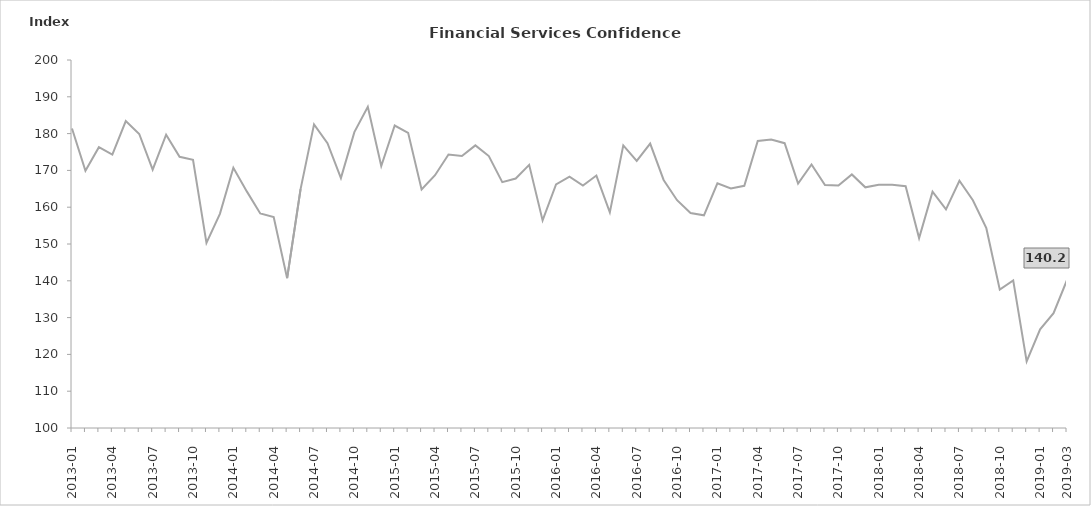
| Category | FSCI |
|---|---|
| 2013-01 | 181.4 |
|  | 169.9 |
|  | 176.3 |
| 2013-04 | 174.3 |
|  | 183.4 |
|  | 179.9 |
| 2013-07 | 170.2 |
|  | 179.7 |
|  | 173.7 |
| 2013-10 | 172.9 |
|  | 150.3 |
|  | 158.2 |
| 2014-01 | 170.7 |
|  | 164.3 |
|  | 158.3 |
| 2014-04 | 157.3 |
|  | 140.7 |
|  | 164.9 |
| 2014-07 | 182.5 |
|  | 177.4 |
|  | 167.9 |
| 2014-10 | 180.4 |
|  | 187.3 |
|  | 171.2 |
| 2015-01 | 182.2 |
|  | 180.2 |
|  | 164.8 |
| 2015-04 | 168.7 |
|  | 174.3 |
|  | 173.9 |
| 2015-07 | 176.8 |
|  | 173.9 |
|  | 166.8 |
| 2015-10 | 167.8 |
|  | 171.5 |
|  | 156.4 |
| 2016-01 | 166.2 |
|  | 168.3 |
|  | 165.9 |
| 2016-04 | 168.6 |
|  | 158.6 |
|  | 176.8 |
| 2016-07 | 172.6 |
|  | 177.3 |
|  | 167.4 |
| 2016-10 | 161.9 |
|  | 158.4 |
|  | 157.8 |
| 2017-01 | 166.5 |
|  | 165.1 |
|  | 165.8 |
| 2017-04 | 178 |
|  | 178.4 |
|  | 177.4 |
| 2017-07 | 166.4 |
|  | 171.6 |
|  | 166 |
| 2017-10 | 165.9 |
|  | 168.9 |
|  | 165.4 |
| 2018-01 | 166.1 |
|  | 166.1 |
|  | 165.7 |
| 2018-04 | 151.6 |
|  | 164.2 |
|  | 159.4 |
| 2018-07 | 167.2 |
|  | 161.9 |
|  | 154.3 |
| 2018-10 | 137.6 |
|  | 140.1 |
|  | 118.1 |
| 2019-01 | 126.8 |
|  | 131.2 |
| 2019-03 | 140.2 |